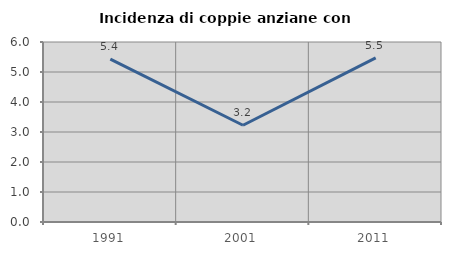
| Category | Incidenza di coppie anziane con figli |
|---|---|
| 1991.0 | 5.426 |
| 2001.0 | 3.226 |
| 2011.0 | 5.469 |